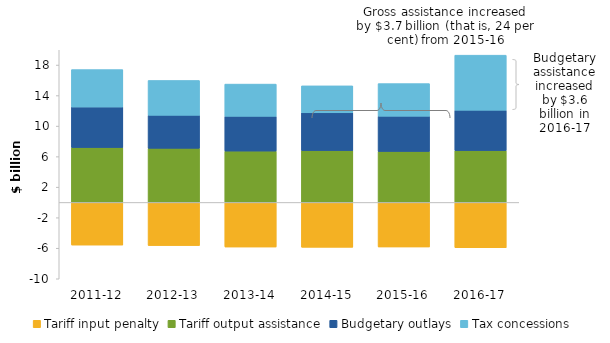
| Category | Tariff input penalty | Tariff output assistance | Budgetary outlays | Tax concessions |
|---|---|---|---|---|
| 2011-12 | -5.585 | 7.195 | 5.305 | 4.9 |
| 2012-13 | -5.649 | 7.094 | 4.32 | 4.566 |
| 2013-14 | -5.838 | 6.725 | 4.554 | 4.225 |
| 2014-15 | -5.876 | 6.792 | 4.949 | 3.532 |
| 2015-16 | -5.827 | 6.686 | 4.61 | 4.269 |
| 2016-17 | -5.925 | 6.789 | 5.291 | 7.212 |